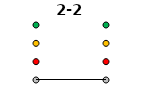
| Category | 0 | 1 | 2 | 3 | 2-2 |
|---|---|---|---|---|---|
| Time 1 | 0 | 1 | 2 | 3 | 0 |
| Time 2 | 0 | 1 | 2 | 3 | 0 |